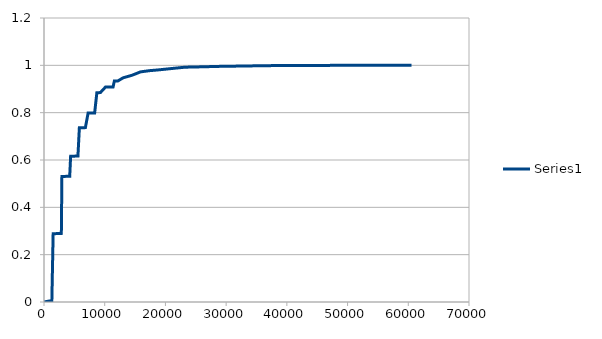
| Category | Series 0 |
|---|---|
| 0.0 | 0 |
| 71.0 | 0 |
| 841.0 | 0.004 |
| 1292.0 | 0.004 |
| 1506.0 | 0.288 |
| 1656.0 | 0.288 |
| 1761.0 | 0.288 |
| 1788.0 | 0.289 |
| 1894.0 | 0.289 |
| 2079.0 | 0.289 |
| 2088.0 | 0.289 |
| 2107.0 | 0.289 |
| 2390.0 | 0.289 |
| 2495.0 | 0.29 |
| 2675.0 | 0.29 |
| 2714.0 | 0.29 |
| 2858.0 | 0.29 |
| 2946.0 | 0.53 |
| 3189.0 | 0.53 |
| 3266.0 | 0.53 |
| 3519.0 | 0.531 |
| 3683.0 | 0.531 |
| 3778.0 | 0.531 |
| 3852.0 | 0.531 |
| 4022.0 | 0.531 |
| 4235.0 | 0.531 |
| 4337.0 | 0.531 |
| 4386.0 | 0.616 |
| 4959.0 | 0.616 |
| 5155.0 | 0.616 |
| 5281.0 | 0.616 |
| 5375.0 | 0.617 |
| 5589.0 | 0.617 |
| 5631.0 | 0.617 |
| 5826.0 | 0.736 |
| 6399.0 | 0.736 |
| 6642.0 | 0.737 |
| 6815.0 | 0.737 |
| 7266.0 | 0.798 |
| 7839.0 | 0.798 |
| 7846.0 | 0.799 |
| 8342.0 | 0.799 |
| 8706.0 | 0.885 |
| 9279.0 | 0.885 |
| 10146.0 | 0.909 |
| 11377.0 | 0.909 |
| 11586.0 | 0.934 |
| 12159.0 | 0.934 |
| 13026.0 | 0.947 |
| 14466.0 | 0.958 |
| 15906.0 | 0.972 |
| 17346.0 | 0.977 |
| 18786.0 | 0.981 |
| 20226.0 | 0.984 |
| 21666.0 | 0.988 |
| 23106.0 | 0.992 |
| 24546.0 | 0.993 |
| 25986.0 | 0.994 |
| 27426.0 | 0.995 |
| 28866.0 | 0.996 |
| 30306.0 | 0.996 |
| 31746.0 | 0.997 |
| 33186.0 | 0.997 |
| 34626.0 | 0.998 |
| 36066.0 | 0.998 |
| 37506.0 | 0.999 |
| 38946.0 | 0.999 |
| 40386.0 | 0.999 |
| 41826.0 | 0.999 |
| 44706.0 | 1 |
| 46146.0 | 1 |
| 51906.0 | 1 |
| 60546.0 | 1 |